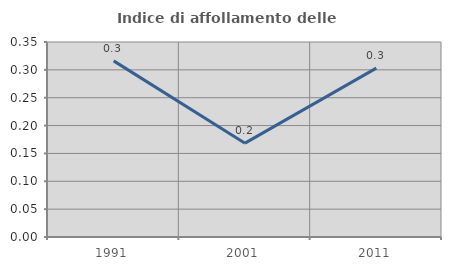
| Category | Indice di affollamento delle abitazioni  |
|---|---|
| 1991.0 | 0.316 |
| 2001.0 | 0.168 |
| 2011.0 | 0.303 |